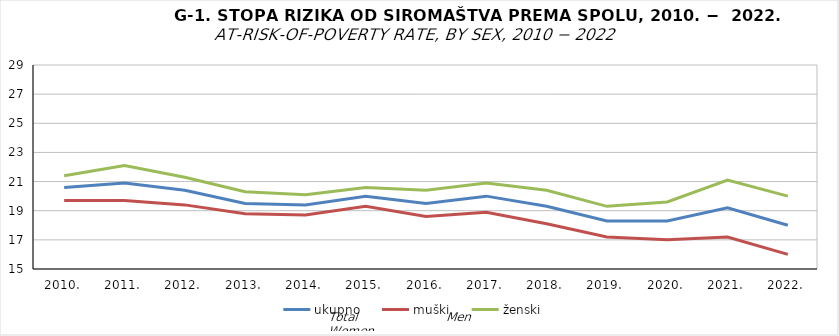
| Category | ukupno | muški | ženski |
|---|---|---|---|
| 2010. | 20.6 | 19.7 | 21.4 |
| 2011. | 20.9 | 19.7 | 22.1 |
| 2012. | 20.4 | 19.4 | 21.3 |
| 2013. | 19.5 | 18.8 | 20.3 |
| 2014. | 19.4 | 18.7 | 20.1 |
| 2015. | 20 | 19.3 | 20.6 |
| 2016. | 19.5 | 18.6 | 20.4 |
| 2017. | 20 | 18.9 | 20.9 |
| 2018. | 19.3 | 18.1 | 20.4 |
| 2019. | 18.3 | 17.2 | 19.3 |
| 2020. | 18.3 | 17 | 19.6 |
| 2021. | 19.2 | 17.2 | 21.1 |
| 2022. | 18 | 16 | 20 |